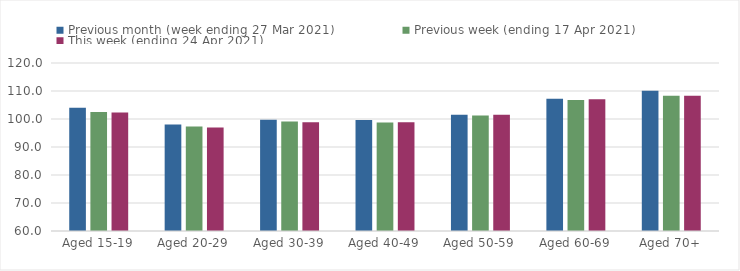
| Category | Previous month (week ending 27 Mar 2021) | Previous week (ending 17 Apr 2021) | This week (ending 24 Apr 2021) |
|---|---|---|---|
| Aged 15-19 | 104.04 | 102.53 | 102.3 |
| Aged 20-29 | 98 | 97.36 | 96.93 |
| Aged 30-39 | 99.77 | 99.07 | 98.85 |
| Aged 40-49 | 99.62 | 98.74 | 98.87 |
| Aged 50-59 | 101.53 | 101.29 | 101.49 |
| Aged 60-69 | 107.23 | 106.83 | 107.04 |
| Aged 70+ | 110.09 | 108.3 | 108.26 |